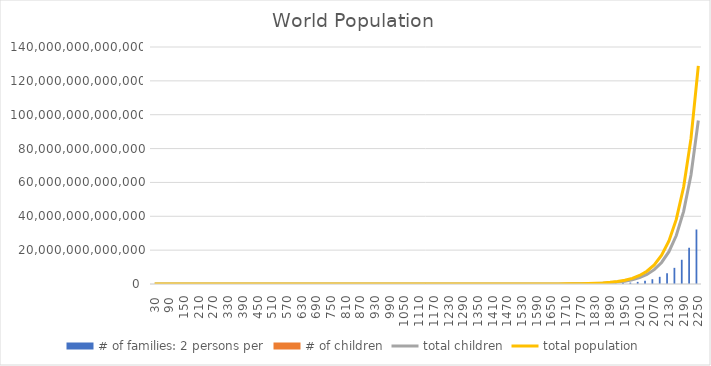
| Category | # of families: 2 persons per | # of children |
|---|---|---|
| 30.0 | 3 | 3 |
| 60.0 | 4.5 | 3 |
| 90.0 | 6.75 | 3 |
| 120.0 | 10.125 | 3 |
| 150.0 | 15.188 | 3 |
| 180.0 | 22.781 | 3 |
| 210.0 | 34.172 | 3 |
| 240.0 | 51.258 | 3 |
| 270.0 | 76.887 | 3 |
| 300.0 | 115.33 | 3 |
| 330.0 | 172.995 | 3 |
| 360.0 | 259.493 | 3 |
| 390.0 | 389.239 | 3 |
| 420.0 | 583.859 | 3 |
| 450.0 | 875.788 | 3 |
| 480.0 | 1313.682 | 3 |
| 510.0 | 1970.523 | 3 |
| 540.0 | 2955.784 | 3 |
| 570.0 | 4433.676 | 3 |
| 600.0 | 6650.513 | 3 |
| 630.0 | 9975.77 | 3 |
| 660.0 | 14963.655 | 3 |
| 690.0 | 22445.483 | 3 |
| 720.0 | 33668.224 | 3 |
| 750.0 | 50502.337 | 3 |
| 780.0 | 75753.505 | 3 |
| 810.0 | 113630.257 | 3 |
| 840.0 | 170445.386 | 3 |
| 870.0 | 255668.079 | 3 |
| 900.0 | 383502.118 | 3 |
| 930.0 | 575253.178 | 3 |
| 960.0 | 862879.767 | 3 |
| 990.0 | 1294319.65 | 3 |
| 1020.0 | 1941479.475 | 3 |
| 1050.0 | 2912219.212 | 3 |
| 1080.0 | 4368328.818 | 3 |
| 1110.0 | 6552493.227 | 3 |
| 1140.0 | 9828739.841 | 3 |
| 1170.0 | 14743109.761 | 3 |
| 1200.0 | 22114664.642 | 3 |
| 1230.0 | 33171996.963 | 3 |
| 1260.0 | 49757995.444 | 3 |
| 1290.0 | 74636993.166 | 3 |
| 1320.0 | 111955489.75 | 3 |
| 1350.0 | 167933234.624 | 3 |
| 1380.0 | 251899851.936 | 3 |
| 1410.0 | 377849777.905 | 3 |
| 1440.0 | 566774666.857 | 3 |
| 1470.0 | 850162000.285 | 3 |
| 1500.0 | 1275243000.428 | 3 |
| 1530.0 | 1912864500.642 | 3 |
| 1560.0 | 2869296750.963 | 3 |
| 1590.0 | 4303945126.445 | 3 |
| 1620.0 | 6455917689.667 | 3 |
| 1650.0 | 9683876534.501 | 3 |
| 1680.0 | 14525814801.751 | 3 |
| 1710.0 | 21788722202.627 | 3 |
| 1740.0 | 32683083303.94 | 3 |
| 1770.0 | 49024624955.911 | 3 |
| 1800.0 | 73536937433.866 | 3 |
| 1830.0 | 110305406150.799 | 3 |
| 1860.0 | 165458109226.199 | 3 |
| 1890.0 | 248187163839.298 | 3 |
| 1920.0 | 372280745758.947 | 3 |
| 1950.0 | 558421118638.42 | 3 |
| 1980.0 | 837631677957.631 | 3 |
| 2010.0 | 1256447516936.446 | 3 |
| 2040.0 | 1884671275404.669 | 3 |
| 2070.0 | 2827006913107.003 | 3 |
| 2100.0 | 4240510369660.504 | 3 |
| 2130.0 | 6360765554490.757 | 3 |
| 2160.0 | 9541148331736.135 | 3 |
| 2190.0 | 14311722497604.203 | 3 |
| 2220.0 | 21467583746406.305 | 3 |
| 2250.0 | 32201375619609.457 | 3 |